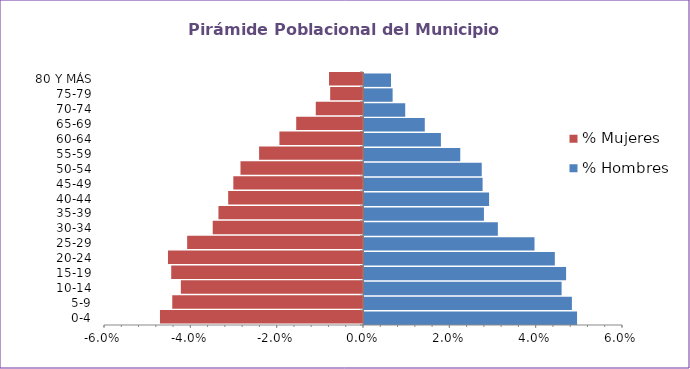
| Category | % Hombres | % Mujeres |
|---|---|---|
| 0-4 | 0.049 | -0.047 |
| 5-9 | 0.048 | -0.044 |
| 10-14 | 0.046 | -0.042 |
| 15-19 | 0.047 | -0.044 |
| 20-24 | 0.044 | -0.045 |
| 25-29 | 0.039 | -0.041 |
| 30-34 | 0.031 | -0.035 |
| 35-39 | 0.028 | -0.033 |
| 40-44 | 0.029 | -0.031 |
| 45-49 | 0.027 | -0.03 |
| 50-54 | 0.027 | -0.028 |
| 55-59 | 0.022 | -0.024 |
| 60-64 | 0.018 | -0.019 |
| 65-69 | 0.014 | -0.015 |
| 70-74 | 0.01 | -0.011 |
| 75-79 | 0.007 | -0.008 |
| 80 Y MÁS | 0.006 | -0.008 |